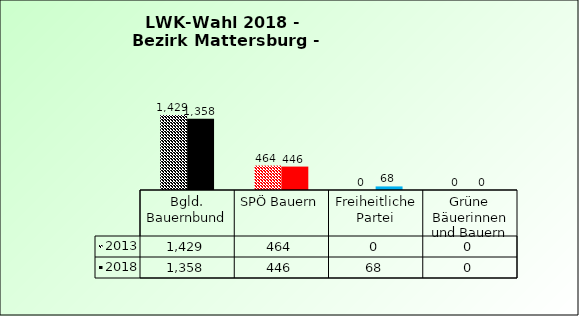
| Category | 2013 | 2018 |
|---|---|---|
| Bgld. Bauernbund | 1429 | 1358 |
| SPÖ Bauern | 464 | 446 |
| Freiheitliche Partei | 0 | 68 |
| Grüne Bäuerinnen und Bauern | 0 | 0 |